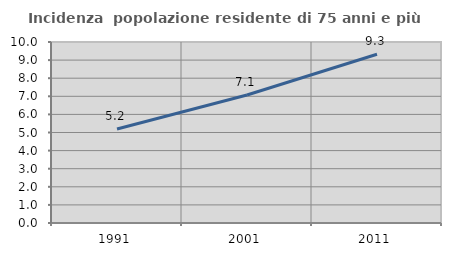
| Category | Incidenza  popolazione residente di 75 anni e più |
|---|---|
| 1991.0 | 5.197 |
| 2001.0 | 7.075 |
| 2011.0 | 9.32 |